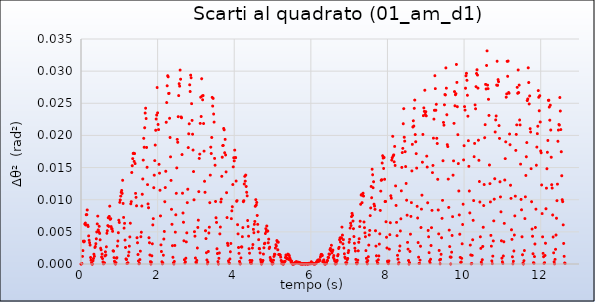
| Category | Series 0 |
|---|---|
| 0.0 | 0 |
| 0.0125 | 0 |
| 0.025 | 0 |
| 0.037500000000000006 | 0.001 |
| 0.05 | 0.002 |
| 0.0625 | 0.004 |
| 0.075 | 0.003 |
| 0.0875 | 0.004 |
| 0.09999999999999999 | 0.006 |
| 0.11249999999999999 | 0.006 |
| 0.12499999999999999 | 0.006 |
| 0.13749999999999998 | 0.008 |
| 0.15 | 0.008 |
| 0.1625 | 0.008 |
| 0.17500000000000002 | 0.006 |
| 0.18750000000000003 | 0.006 |
| 0.20000000000000004 | 0.004 |
| 0.21250000000000005 | 0.004 |
| 0.22500000000000006 | 0.003 |
| 0.23750000000000007 | 0.003 |
| 0.25000000000000006 | 0.001 |
| 0.26250000000000007 | 0.001 |
| 0.2750000000000001 | 0 |
| 0.2875000000000001 | 0 |
| 0.3000000000000001 | 0 |
| 0.3125000000000001 | 0 |
| 0.3250000000000001 | 0.001 |
| 0.33750000000000013 | 0.002 |
| 0.35000000000000014 | 0.001 |
| 0.36250000000000016 | 0.003 |
| 0.37500000000000017 | 0.003 |
| 0.3875000000000002 | 0.003 |
| 0.4000000000000002 | 0.004 |
| 0.4125000000000002 | 0.005 |
| 0.4250000000000002 | 0.006 |
| 0.4375000000000002 | 0.007 |
| 0.45000000000000023 | 0.005 |
| 0.46250000000000024 | 0.005 |
| 0.47500000000000026 | 0.006 |
| 0.48750000000000027 | 0.005 |
| 0.5000000000000002 | 0.004 |
| 0.5125000000000002 | 0.002 |
| 0.5250000000000001 | 0.002 |
| 0.5375000000000001 | 0.001 |
| 0.55 | 0.002 |
| 0.5625 | 0.001 |
| 0.575 | 0 |
| 0.5874999999999999 | 0 |
| 0.5999999999999999 | 0 |
| 0.6124999999999998 | 0 |
| 0.6249999999999998 | 0.001 |
| 0.6374999999999997 | 0.002 |
| 0.6499999999999997 | 0.001 |
| 0.6624999999999996 | 0.003 |
| 0.6749999999999996 | 0.005 |
| 0.6874999999999996 | 0.005 |
| 0.6999999999999995 | 0.006 |
| 0.7124999999999995 | 0.007 |
| 0.7249999999999994 | 0.006 |
| 0.7374999999999994 | 0.007 |
| 0.7499999999999993 | 0.009 |
| 0.7624999999999993 | 0.007 |
| 0.7749999999999992 | 0.007 |
| 0.7874999999999992 | 0.006 |
| 0.7999999999999992 | 0.006 |
| 0.8124999999999991 | 0.005 |
| 0.8249999999999991 | 0.005 |
| 0.837499999999999 | 0.002 |
| 0.849999999999999 | 0.002 |
| 0.8624999999999989 | 0.001 |
| 0.8749999999999989 | 0 |
| 0.8874999999999988 | 0 |
| 0.8999999999999988 | 0 |
| 0.9124999999999988 | 0 |
| 0.9249999999999987 | 0.001 |
| 0.9374999999999987 | 0.001 |
| 0.9499999999999986 | 0.003 |
| 0.9624999999999986 | 0.004 |
| 0.9749999999999985 | 0.005 |
| 0.9874999999999985 | 0.007 |
| 0.9999999999999984 | 0.006 |
| 1.0124999999999984 | 0.01 |
| 1.0249999999999984 | 0.01 |
| 1.0374999999999983 | 0.011 |
| 1.0499999999999983 | 0.011 |
| 1.0624999999999982 | 0.011 |
| 1.0749999999999982 | 0.011 |
| 1.0874999999999981 | 0.013 |
| 1.099999999999998 | 0.009 |
| 1.112499999999998 | 0.007 |
| 1.124999999999998 | 0.006 |
| 1.137499999999998 | 0.006 |
| 1.149999999999998 | 0.004 |
| 1.1624999999999979 | 0.003 |
| 1.1749999999999978 | 0.001 |
| 1.1874999999999978 | 0.001 |
| 1.1999999999999977 | 0 |
| 1.2124999999999977 | 0 |
| 1.2249999999999976 | 0 |
| 1.2374999999999976 | 0.001 |
| 1.2499999999999976 | 0.002 |
| 1.2624999999999975 | 0.003 |
| 1.2749999999999975 | 0.004 |
| 1.2874999999999974 | 0.006 |
| 1.2999999999999974 | 0.009 |
| 1.3124999999999973 | 0.01 |
| 1.3249999999999973 | 0.014 |
| 1.3374999999999972 | 0.015 |
| 1.3499999999999972 | 0.016 |
| 1.3624999999999972 | 0.017 |
| 1.3749999999999971 | 0.017 |
| 1.387499999999997 | 0.016 |
| 1.399999999999997 | 0.017 |
| 1.412499999999997 | 0.016 |
| 1.424999999999997 | 0.011 |
| 1.437499999999997 | 0.01 |
| 1.4499999999999968 | 0.009 |
| 1.4624999999999968 | 0.004 |
| 1.4749999999999968 | 0.003 |
| 1.4874999999999967 | 0.001 |
| 1.4999999999999967 | 0 |
| 1.5124999999999966 | 0 |
| 1.5249999999999966 | 0 |
| 1.5374999999999965 | 0.001 |
| 1.5499999999999965 | 0.002 |
| 1.5624999999999964 | 0.004 |
| 1.5749999999999964 | 0.005 |
| 1.5874999999999964 | 0.009 |
| 1.5999999999999963 | 0.011 |
| 1.6124999999999963 | 0.013 |
| 1.6249999999999962 | 0.016 |
| 1.6374999999999962 | 0.02 |
| 1.6499999999999961 | 0.018 |
| 1.662499999999996 | 0.021 |
| 1.674999999999996 | 0.023 |
| 1.687499999999996 | 0.024 |
| 1.699999999999996 | 0.023 |
| 1.712499999999996 | 0.018 |
| 1.7249999999999959 | 0.015 |
| 1.7374999999999958 | 0.012 |
| 1.7499999999999958 | 0.009 |
| 1.7624999999999957 | 0.009 |
| 1.7749999999999957 | 0.004 |
| 1.7874999999999956 | 0.003 |
| 1.7999999999999956 | 0.001 |
| 1.8124999999999956 | 0 |
| 1.8249999999999955 | 0 |
| 1.8374999999999955 | 0 |
| 1.8499999999999954 | 0.001 |
| 1.8624999999999954 | 0.003 |
| 1.8749999999999953 | 0.006 |
| 1.8874999999999953 | 0.007 |
| 1.8999999999999952 | 0.012 |
| 1.9124999999999952 | 0.014 |
| 1.9249999999999952 | 0.016 |
| 1.9374999999999951 | 0.019 |
| 1.949999999999995 | 0.021 |
| 1.962499999999995 | 0.023 |
| 1.974999999999995 | 0.023 |
| 1.987499999999995 | 0.027 |
| 1.999999999999995 | 0.024 |
| 2.012499999999995 | 0.022 |
| 2.024999999999995 | 0.021 |
| 2.037499999999995 | 0.016 |
| 2.0499999999999954 | 0.014 |
| 2.0624999999999956 | 0.011 |
| 2.0749999999999957 | 0.007 |
| 2.087499999999996 | 0.003 |
| 2.099999999999996 | 0.002 |
| 2.1124999999999963 | 0 |
| 2.1249999999999964 | 0 |
| 2.1374999999999966 | 0 |
| 2.149999999999997 | 0.001 |
| 2.162499999999997 | 0.004 |
| 2.174999999999997 | 0.005 |
| 2.1874999999999973 | 0.01 |
| 2.1999999999999975 | 0.012 |
| 2.2124999999999977 | 0.014 |
| 2.224999999999998 | 0.022 |
| 2.237499999999998 | 0.025 |
| 2.2499999999999982 | 0.028 |
| 2.2624999999999984 | 0.029 |
| 2.2749999999999986 | 0.029 |
| 2.2874999999999988 | 0.027 |
| 2.299999999999999 | 0.027 |
| 2.312499999999999 | 0.023 |
| 2.3249999999999993 | 0.02 |
| 2.3374999999999995 | 0.017 |
| 2.3499999999999996 | 0.013 |
| 2.3625 | 0.009 |
| 2.375 | 0.006 |
| 2.3875 | 0.003 |
| 2.4000000000000004 | 0.001 |
| 2.4125000000000005 | 0 |
| 2.4250000000000007 | 0 |
| 2.437500000000001 | 0 |
| 2.450000000000001 | 0.003 |
| 2.4625000000000012 | 0.005 |
| 2.4750000000000014 | 0.008 |
| 2.4875000000000016 | 0.011 |
| 2.5000000000000018 | 0.015 |
| 2.512500000000002 | 0.019 |
| 2.525000000000002 | 0.019 |
| 2.5375000000000023 | 0.023 |
| 2.5500000000000025 | 0.026 |
| 2.5625000000000027 | 0.028 |
| 2.575000000000003 | 0.028 |
| 2.587500000000003 | 0.03 |
| 2.600000000000003 | 0.029 |
| 2.6125000000000034 | 0.023 |
| 2.6250000000000036 | 0.023 |
| 2.6375000000000037 | 0.017 |
| 2.650000000000004 | 0.011 |
| 2.662500000000004 | 0.008 |
| 2.6750000000000043 | 0.006 |
| 2.6875000000000044 | 0.004 |
| 2.7000000000000046 | 0.001 |
| 2.712500000000005 | 0 |
| 2.725000000000005 | 0 |
| 2.737500000000005 | 0.001 |
| 2.7500000000000053 | 0.003 |
| 2.7625000000000055 | 0.005 |
| 2.7750000000000057 | 0.01 |
| 2.787500000000006 | 0.012 |
| 2.800000000000006 | 0.018 |
| 2.812500000000006 | 0.02 |
| 2.8250000000000064 | 0.022 |
| 2.8375000000000066 | 0.028 |
| 2.8500000000000068 | 0.027 |
| 2.862500000000007 | 0.029 |
| 2.875000000000007 | 0.029 |
| 2.8875000000000073 | 0.025 |
| 2.9000000000000075 | 0.022 |
| 2.9125000000000076 | 0.02 |
| 2.925000000000008 | 0.018 |
| 2.937500000000008 | 0.014 |
| 2.950000000000008 | 0.01 |
| 2.9625000000000083 | 0.005 |
| 2.9750000000000085 | 0.004 |
| 2.9875000000000087 | 0.001 |
| 3.000000000000009 | 0 |
| 3.012500000000009 | 0 |
| 3.0250000000000092 | 0.001 |
| 3.0375000000000094 | 0.002 |
| 3.0500000000000096 | 0.006 |
| 3.0625000000000098 | 0.007 |
| 3.07500000000001 | 0.011 |
| 3.08750000000001 | 0.016 |
| 3.1000000000000103 | 0.017 |
| 3.1125000000000105 | 0.022 |
| 3.1250000000000107 | 0.026 |
| 3.137500000000011 | 0.023 |
| 3.150000000000011 | 0.029 |
| 3.162500000000011 | 0.026 |
| 3.1750000000000114 | 0.026 |
| 3.1875000000000115 | 0.026 |
| 3.2000000000000117 | 0.022 |
| 3.212500000000012 | 0.018 |
| 3.225000000000012 | 0.013 |
| 3.2375000000000123 | 0.011 |
| 3.2500000000000124 | 0.005 |
| 3.2625000000000126 | 0.004 |
| 3.275000000000013 | 0.002 |
| 3.287500000000013 | 0.001 |
| 3.300000000000013 | 0 |
| 3.3125000000000133 | 0 |
| 3.3250000000000135 | 0.002 |
| 3.3375000000000137 | 0.005 |
| 3.350000000000014 | 0.006 |
| 3.362500000000014 | 0.01 |
| 3.375000000000014 | 0.014 |
| 3.3875000000000144 | 0.018 |
| 3.4000000000000146 | 0.017 |
| 3.4125000000000147 | 0.02 |
| 3.425000000000015 | 0.026 |
| 3.437500000000015 | 0.025 |
| 3.4500000000000153 | 0.026 |
| 3.4625000000000155 | 0.023 |
| 3.4750000000000156 | 0.022 |
| 3.487500000000016 | 0.016 |
| 3.500000000000016 | 0.015 |
| 3.512500000000016 | 0.01 |
| 3.5250000000000163 | 0.007 |
| 3.5375000000000165 | 0.006 |
| 3.5500000000000167 | 0.002 |
| 3.562500000000017 | 0.002 |
| 3.575000000000017 | 0 |
| 3.5875000000000172 | 0 |
| 3.6000000000000174 | 0.001 |
| 3.6125000000000176 | 0.002 |
| 3.6250000000000178 | 0.005 |
| 3.637500000000018 | 0.006 |
| 3.650000000000018 | 0.01 |
| 3.6625000000000183 | 0.01 |
| 3.6750000000000185 | 0.014 |
| 3.6875000000000187 | 0.017 |
| 3.700000000000019 | 0.018 |
| 3.712500000000019 | 0.018 |
| 3.725000000000019 | 0.021 |
| 3.7375000000000194 | 0.021 |
| 3.7500000000000195 | 0.017 |
| 3.7625000000000197 | 0.019 |
| 3.77500000000002 | 0.017 |
| 3.78750000000002 | 0.014 |
| 3.8000000000000203 | 0.011 |
| 3.8125000000000204 | 0.007 |
| 3.8250000000000206 | 0.003 |
| 3.837500000000021 | 0.003 |
| 3.850000000000021 | 0 |
| 3.862500000000021 | 0 |
| 3.8750000000000213 | 0 |
| 3.8875000000000215 | 0.001 |
| 3.9000000000000217 | 0.002 |
| 3.912500000000022 | 0.003 |
| 3.925000000000022 | 0.007 |
| 3.937500000000022 | 0.008 |
| 3.9500000000000224 | 0.009 |
| 3.9625000000000226 | 0.012 |
| 3.9750000000000227 | 0.015 |
| 3.987500000000023 | 0.017 |
| 4.000000000000023 | 0.016 |
| 4.012500000000023 | 0.018 |
| 4.0250000000000234 | 0.017 |
| 4.037500000000024 | 0.017 |
| 4.050000000000024 | 0.013 |
| 4.062500000000024 | 0.01 |
| 4.075000000000024 | 0.01 |
| 4.087500000000024 | 0.006 |
| 4.1000000000000245 | 0.005 |
| 4.112500000000025 | 0.003 |
| 4.125000000000025 | 0.002 |
| 4.137500000000025 | 0 |
| 4.150000000000025 | 0 |
| 4.162500000000025 | 0 |
| 4.175000000000026 | 0.001 |
| 4.187500000000026 | 0.003 |
| 4.200000000000026 | 0.003 |
| 4.212500000000026 | 0.004 |
| 4.225000000000026 | 0.006 |
| 4.2375000000000265 | 0.01 |
| 4.250000000000027 | 0.01 |
| 4.262500000000027 | 0.012 |
| 4.275000000000027 | 0.014 |
| 4.287500000000027 | 0.013 |
| 4.300000000000027 | 0.014 |
| 4.3125000000000275 | 0.012 |
| 4.325000000000028 | 0.011 |
| 4.337500000000028 | 0.011 |
| 4.350000000000028 | 0.007 |
| 4.362500000000028 | 0.006 |
| 4.375000000000028 | 0.004 |
| 4.387500000000029 | 0.002 |
| 4.400000000000029 | 0.002 |
| 4.412500000000029 | 0.001 |
| 4.425000000000029 | 0 |
| 4.437500000000029 | 0 |
| 4.4500000000000295 | 0 |
| 4.46250000000003 | 0.001 |
| 4.47500000000003 | 0.002 |
| 4.48750000000003 | 0.003 |
| 4.50000000000003 | 0.005 |
| 4.51250000000003 | 0.005 |
| 4.5250000000000306 | 0.006 |
| 4.537500000000031 | 0.007 |
| 4.550000000000031 | 0.009 |
| 4.562500000000031 | 0.01 |
| 4.575000000000031 | 0.009 |
| 4.587500000000031 | 0.01 |
| 4.600000000000032 | 0.008 |
| 4.612500000000032 | 0.006 |
| 4.625000000000032 | 0.005 |
| 4.637500000000032 | 0.004 |
| 4.650000000000032 | 0.002 |
| 4.6625000000000325 | 0.002 |
| 4.675000000000033 | 0.002 |
| 4.687500000000033 | 0.001 |
| 4.700000000000033 | 0 |
| 4.712500000000033 | 0 |
| 4.725000000000033 | 0 |
| 4.737500000000034 | 0 |
| 4.750000000000034 | 0.001 |
| 4.762500000000034 | 0.002 |
| 4.775000000000034 | 0.003 |
| 4.787500000000034 | 0.003 |
| 4.8000000000000345 | 0.003 |
| 4.812500000000035 | 0.005 |
| 4.825000000000035 | 0.005 |
| 4.837500000000035 | 0.005 |
| 4.850000000000035 | 0.006 |
| 4.862500000000035 | 0.005 |
| 4.8750000000000355 | 0.005 |
| 4.887500000000036 | 0.003 |
| 4.900000000000036 | 0.004 |
| 4.912500000000036 | 0.002 |
| 4.925000000000036 | 0.003 |
| 4.937500000000036 | 0.001 |
| 4.950000000000037 | 0.001 |
| 4.962500000000037 | 0.001 |
| 4.975000000000037 | 0 |
| 4.987500000000037 | 0 |
| 5.000000000000037 | 0 |
| 5.0125000000000375 | 0 |
| 5.025000000000038 | 0.001 |
| 5.037500000000038 | 0.001 |
| 5.050000000000038 | 0.002 |
| 5.062500000000038 | 0.001 |
| 5.075000000000038 | 0.002 |
| 5.0875000000000385 | 0.003 |
| 5.100000000000039 | 0.003 |
| 5.112500000000039 | 0.004 |
| 5.125000000000039 | 0.003 |
| 5.137500000000039 | 0.002 |
| 5.150000000000039 | 0.003 |
| 5.16250000000004 | 0.001 |
| 5.17500000000004 | 0.001 |
| 5.18750000000004 | 0.001 |
| 5.20000000000004 | 0.001 |
| 5.21250000000004 | 0.001 |
| 5.2250000000000405 | 0.001 |
| 5.237500000000041 | 0 |
| 5.250000000000041 | 0 |
| 5.262500000000041 | 0 |
| 5.275000000000041 | 0 |
| 5.287500000000041 | 0 |
| 5.300000000000042 | 0 |
| 5.312500000000042 | 0 |
| 5.325000000000042 | 0 |
| 5.337500000000042 | 0.001 |
| 5.350000000000042 | 0.001 |
| 5.3625000000000425 | 0.001 |
| 5.375000000000043 | 0.001 |
| 5.387500000000043 | 0.001 |
| 5.400000000000043 | 0.002 |
| 5.412500000000043 | 0.001 |
| 5.425000000000043 | 0.001 |
| 5.4375000000000435 | 0.001 |
| 5.450000000000044 | 0.001 |
| 5.462500000000044 | 0.001 |
| 5.475000000000044 | 0 |
| 5.487500000000044 | 0 |
| 5.500000000000044 | 0 |
| 5.512500000000045 | 0 |
| 5.525000000000045 | 0 |
| 5.537500000000045 | 0 |
| 5.550000000000045 | 0 |
| 5.562500000000045 | 0 |
| 5.5750000000000455 | 0 |
| 5.587500000000046 | 0 |
| 5.600000000000046 | 0 |
| 5.612500000000046 | 0 |
| 5.625000000000046 | 0 |
| 5.637500000000046 | 0 |
| 5.6500000000000465 | 0 |
| 5.662500000000047 | 0 |
| 5.675000000000047 | 0 |
| 5.687500000000047 | 0 |
| 5.700000000000047 | 0 |
| 5.712500000000047 | 0 |
| 5.725000000000048 | 0 |
| 5.737500000000048 | 0 |
| 5.750000000000048 | 0 |
| 5.762500000000048 | 0 |
| 5.775000000000048 | 0 |
| 5.7875000000000485 | 0 |
| 5.800000000000049 | 0 |
| 5.812500000000049 | 0 |
| 5.825000000000049 | 0 |
| 5.837500000000049 | 0 |
| 5.850000000000049 | 0 |
| 5.86250000000005 | 0 |
| 5.87500000000005 | 0 |
| 5.88750000000005 | 0 |
| 5.90000000000005 | 0 |
| 5.91250000000005 | 0 |
| 5.9250000000000504 | 0 |
| 5.937500000000051 | 0 |
| 5.950000000000051 | 0 |
| 5.962500000000051 | 0 |
| 5.975000000000051 | 0 |
| 5.987500000000051 | 0 |
| 6.0000000000000515 | 0 |
| 6.012500000000052 | 0 |
| 6.025000000000052 | 0 |
| 6.037500000000052 | 0 |
| 6.050000000000052 | 0 |
| 6.062500000000052 | 0 |
| 6.075000000000053 | 0 |
| 6.087500000000053 | 0 |
| 6.100000000000053 | 0 |
| 6.112500000000053 | 0 |
| 6.125000000000053 | 0 |
| 6.1375000000000535 | 0 |
| 6.150000000000054 | 0 |
| 6.162500000000054 | 0 |
| 6.175000000000054 | 0.001 |
| 6.187500000000054 | 0 |
| 6.200000000000054 | 0.001 |
| 6.2125000000000545 | 0 |
| 6.225000000000055 | 0.001 |
| 6.237500000000055 | 0.001 |
| 6.250000000000055 | 0.001 |
| 6.262500000000055 | 0.001 |
| 6.275000000000055 | 0.001 |
| 6.287500000000056 | 0.001 |
| 6.300000000000056 | 0.001 |
| 6.312500000000056 | 0 |
| 6.325000000000056 | 0 |
| 6.337500000000056 | 0.001 |
| 6.3500000000000565 | 0 |
| 6.362500000000057 | 0 |
| 6.375000000000057 | 0 |
| 6.387500000000057 | 0 |
| 6.400000000000057 | 0 |
| 6.412500000000057 | 0 |
| 6.4250000000000576 | 0.001 |
| 6.437500000000058 | 0.001 |
| 6.450000000000058 | 0.001 |
| 6.462500000000058 | 0.001 |
| 6.475000000000058 | 0.002 |
| 6.487500000000058 | 0.001 |
| 6.500000000000059 | 0.002 |
| 6.512500000000059 | 0.002 |
| 6.525000000000059 | 0.002 |
| 6.537500000000059 | 0.003 |
| 6.550000000000059 | 0.002 |
| 6.5625000000000595 | 0.002 |
| 6.57500000000006 | 0.002 |
| 6.58750000000006 | 0.001 |
| 6.60000000000006 | 0.001 |
| 6.61250000000006 | 0.001 |
| 6.62500000000006 | 0 |
| 6.637500000000061 | 0 |
| 6.650000000000061 | 0 |
| 6.662500000000061 | 0 |
| 6.675000000000061 | 0 |
| 6.687500000000061 | 0.001 |
| 6.7000000000000615 | 0.001 |
| 6.712500000000062 | 0.001 |
| 6.725000000000062 | 0.002 |
| 6.737500000000062 | 0.003 |
| 6.750000000000062 | 0.004 |
| 6.762500000000062 | 0.004 |
| 6.7750000000000625 | 0.003 |
| 6.787500000000063 | 0.004 |
| 6.800000000000063 | 0.004 |
| 6.812500000000063 | 0.006 |
| 6.825000000000063 | 0.004 |
| 6.837500000000063 | 0.003 |
| 6.850000000000064 | 0.004 |
| 6.862500000000064 | 0.002 |
| 6.875000000000064 | 0.002 |
| 6.887500000000064 | 0.001 |
| 6.900000000000064 | 0.001 |
| 6.9125000000000645 | 0 |
| 6.925000000000065 | 0 |
| 6.937500000000065 | 0 |
| 6.950000000000065 | 0.001 |
| 6.962500000000065 | 0.001 |
| 6.975000000000065 | 0.002 |
| 6.9875000000000655 | 0.002 |
| 7.000000000000066 | 0.003 |
| 7.012500000000066 | 0.004 |
| 7.025000000000066 | 0.006 |
| 7.037500000000066 | 0.006 |
| 7.050000000000066 | 0.006 |
| 7.062500000000067 | 0.007 |
| 7.075000000000067 | 0.008 |
| 7.087500000000067 | 0.008 |
| 7.100000000000067 | 0.007 |
| 7.112500000000067 | 0.005 |
| 7.1250000000000675 | 0.004 |
| 7.137500000000068 | 0.003 |
| 7.150000000000068 | 0.002 |
| 7.162500000000068 | 0.002 |
| 7.175000000000068 | 0.001 |
| 7.187500000000068 | 0 |
| 7.200000000000069 | 0 |
| 7.212500000000069 | 0 |
| 7.225000000000069 | 0.001 |
| 7.237500000000069 | 0.002 |
| 7.250000000000069 | 0.003 |
| 7.2625000000000695 | 0.004 |
| 7.27500000000007 | 0.006 |
| 7.28750000000007 | 0.007 |
| 7.30000000000007 | 0.009 |
| 7.31250000000007 | 0.011 |
| 7.32500000000007 | 0.011 |
| 7.3375000000000705 | 0.01 |
| 7.350000000000071 | 0.011 |
| 7.362500000000071 | 0.011 |
| 7.375000000000071 | 0.011 |
| 7.387500000000071 | 0.007 |
| 7.400000000000071 | 0.006 |
| 7.412500000000072 | 0.005 |
| 7.425000000000072 | 0.004 |
| 7.437500000000072 | 0.002 |
| 7.450000000000072 | 0.001 |
| 7.462500000000072 | 0 |
| 7.4750000000000725 | 0 |
| 7.487500000000073 | 0.001 |
| 7.500000000000073 | 0.001 |
| 7.512500000000073 | 0.003 |
| 7.525000000000073 | 0.005 |
| 7.537500000000073 | 0.005 |
| 7.5500000000000735 | 0.008 |
| 7.562500000000074 | 0.009 |
| 7.575000000000074 | 0.012 |
| 7.587500000000074 | 0.01 |
| 7.600000000000074 | 0.015 |
| 7.612500000000074 | 0.014 |
| 7.625000000000075 | 0.012 |
| 7.637500000000075 | 0.013 |
| 7.650000000000075 | 0.009 |
| 7.662500000000075 | 0.009 |
| 7.675000000000075 | 0.009 |
| 7.6875000000000755 | 0.005 |
| 7.700000000000076 | 0.003 |
| 7.712500000000076 | 0.001 |
| 7.725000000000076 | 0 |
| 7.737500000000076 | 0 |
| 7.750000000000076 | 0 |
| 7.762500000000077 | 0.001 |
| 7.775000000000077 | 0.001 |
| 7.787500000000077 | 0.003 |
| 7.800000000000077 | 0.005 |
| 7.812500000000077 | 0.008 |
| 7.8250000000000774 | 0.011 |
| 7.837500000000078 | 0.013 |
| 7.850000000000078 | 0.013 |
| 7.862500000000078 | 0.016 |
| 7.875000000000078 | 0.017 |
| 7.887500000000078 | 0.016 |
| 7.9000000000000785 | 0.015 |
| 7.912500000000079 | 0.017 |
| 7.925000000000079 | 0.013 |
| 7.937500000000079 | 0.01 |
| 7.950000000000079 | 0.01 |
| 7.962500000000079 | 0.007 |
| 7.97500000000008 | 0.004 |
| 7.98750000000008 | 0.002 |
| 8.00000000000008 | 0 |
| 8.01250000000008 | 0 |
| 8.025000000000079 | 0 |
| 8.037500000000078 | 0 |
| 8.050000000000077 | 0.002 |
| 8.062500000000076 | 0.005 |
| 8.075000000000076 | 0.006 |
| 8.087500000000075 | 0.011 |
| 8.100000000000074 | 0.01 |
| 8.112500000000074 | 0.016 |
| 8.125000000000073 | 0.017 |
| 8.137500000000072 | 0.02 |
| 8.150000000000071 | 0.017 |
| 8.16250000000007 | 0.017 |
| 8.17500000000007 | 0.016 |
| 8.18750000000007 | 0.018 |
| 8.200000000000069 | 0.015 |
| 8.212500000000068 | 0.012 |
| 8.225000000000067 | 0.009 |
| 8.237500000000066 | 0.006 |
| 8.250000000000066 | 0.004 |
| 8.262500000000065 | 0.001 |
| 8.275000000000064 | 0.001 |
| 8.287500000000064 | 0 |
| 8.300000000000063 | 0 |
| 8.312500000000062 | 0.002 |
| 8.325000000000061 | 0.003 |
| 8.33750000000006 | 0.005 |
| 8.35000000000006 | 0.007 |
| 8.36250000000006 | 0.011 |
| 8.375000000000059 | 0.015 |
| 8.387500000000058 | 0.017 |
| 8.400000000000057 | 0.018 |
| 8.412500000000056 | 0.022 |
| 8.425000000000056 | 0.024 |
| 8.437500000000055 | 0.02 |
| 8.450000000000054 | 0.019 |
| 8.462500000000054 | 0.017 |
| 8.475000000000053 | 0.015 |
| 8.487500000000052 | 0.013 |
| 8.500000000000052 | 0.01 |
| 8.51250000000005 | 0.008 |
| 8.52500000000005 | 0.003 |
| 8.53750000000005 | 0.002 |
| 8.550000000000049 | 0.001 |
| 8.562500000000048 | 0 |
| 8.575000000000047 | 0 |
| 8.587500000000047 | 0.002 |
| 8.600000000000046 | 0.005 |
| 8.612500000000045 | 0.007 |
| 8.625000000000044 | 0.01 |
| 8.637500000000044 | 0.014 |
| 8.650000000000043 | 0.019 |
| 8.662500000000042 | 0.021 |
| 8.675000000000042 | 0.022 |
| 8.68750000000004 | 0.021 |
| 8.70000000000004 | 0.024 |
| 8.71250000000004 | 0.025 |
| 8.725000000000039 | 0.02 |
| 8.737500000000038 | 0.019 |
| 8.750000000000037 | 0.017 |
| 8.762500000000037 | 0.015 |
| 8.775000000000036 | 0.009 |
| 8.787500000000035 | 0.007 |
| 8.800000000000034 | 0.003 |
| 8.812500000000034 | 0.001 |
| 8.825000000000033 | 0 |
| 8.837500000000032 | 0 |
| 8.850000000000032 | 0.001 |
| 8.862500000000031 | 0.003 |
| 8.87500000000003 | 0.006 |
| 8.88750000000003 | 0.009 |
| 8.900000000000029 | 0.011 |
| 8.912500000000028 | 0.016 |
| 8.925000000000027 | 0.02 |
| 8.937500000000027 | 0.023 |
| 8.950000000000026 | 0.024 |
| 8.962500000000025 | 0.024 |
| 8.975000000000025 | 0.027 |
| 8.987500000000024 | 0.023 |
| 9.000000000000023 | 0.024 |
| 9.012500000000022 | 0.023 |
| 9.025000000000022 | 0.017 |
| 9.037500000000021 | 0.015 |
| 9.05000000000002 | 0.01 |
| 9.06250000000002 | 0.005 |
| 9.075000000000019 | 0.004 |
| 9.087500000000018 | 0.002 |
| 9.100000000000017 | 0 |
| 9.112500000000017 | 0 |
| 9.125000000000016 | 0.001 |
| 9.137500000000015 | 0.003 |
| 9.150000000000015 | 0.006 |
| 9.162500000000014 | 0.008 |
| 9.175000000000013 | 0.014 |
| 9.187500000000012 | 0.015 |
| 9.200000000000012 | 0.02 |
| 9.212500000000011 | 0.023 |
| 9.22500000000001 | 0.024 |
| 9.23750000000001 | 0.029 |
| 9.250000000000009 | 0.027 |
| 9.262500000000008 | 0.024 |
| 9.275000000000007 | 0.025 |
| 9.287500000000007 | 0.02 |
| 9.300000000000006 | 0.019 |
| 9.312500000000005 | 0.013 |
| 9.325000000000005 | 0.008 |
| 9.337500000000004 | 0.005 |
| 9.350000000000003 | 0.002 |
| 9.362500000000002 | 0.001 |
| 9.375000000000002 | 0 |
| 9.387500000000001 | 0.001 |
| 9.4 | 0.002 |
| 9.4125 | 0.004 |
| 9.424999999999999 | 0.007 |
| 9.437499999999998 | 0.01 |
| 9.449999999999998 | 0.016 |
| 9.462499999999997 | 0.022 |
| 9.474999999999996 | 0.022 |
| 9.487499999999995 | 0.025 |
| 9.499999999999995 | 0.026 |
| 9.512499999999994 | 0.026 |
| 9.524999999999993 | 0.031 |
| 9.537499999999993 | 0.027 |
| 9.549999999999992 | 0.023 |
| 9.562499999999991 | 0.019 |
| 9.57499999999999 | 0.018 |
| 9.58749999999999 | 0.013 |
| 9.599999999999989 | 0.009 |
| 9.612499999999988 | 0.005 |
| 9.624999999999988 | 0.003 |
| 9.637499999999987 | 0.001 |
| 9.649999999999986 | 0 |
| 9.662499999999985 | 0.001 |
| 9.674999999999985 | 0.002 |
| 9.687499999999984 | 0.004 |
| 9.699999999999983 | 0.007 |
| 9.712499999999983 | 0.014 |
| 9.724999999999982 | 0.016 |
| 9.737499999999981 | 0.022 |
| 9.74999999999998 | 0.027 |
| 9.76249999999998 | 0.025 |
| 9.774999999999979 | 0.026 |
| 9.787499999999978 | 0.026 |
| 9.799999999999978 | 0.031 |
| 9.812499999999977 | 0.028 |
| 9.824999999999976 | 0.024 |
| 9.837499999999975 | 0.02 |
| 9.849999999999975 | 0.016 |
| 9.862499999999974 | 0.011 |
| 9.874999999999973 | 0.008 |
| 9.887499999999973 | 0.005 |
| 9.899999999999972 | 0.001 |
| 9.912499999999971 | 0 |
| 9.92499999999997 | 0 |
| 9.93749999999997 | 0.001 |
| 9.949999999999969 | 0.003 |
| 9.962499999999968 | 0.006 |
| 9.974999999999968 | 0.009 |
| 9.987499999999967 | 0.016 |
| 9.999999999999966 | 0.018 |
| 10.012499999999966 | 0.024 |
| 10.024999999999965 | 0.024 |
| 10.037499999999964 | 0.027 |
| 10.049999999999963 | 0.029 |
| 10.062499999999963 | 0.03 |
| 10.074999999999962 | 0.029 |
| 10.087499999999961 | 0.026 |
| 10.09999999999996 | 0.023 |
| 10.11249999999996 | 0.019 |
| 10.12499999999996 | 0.015 |
| 10.137499999999958 | 0.011 |
| 10.149999999999958 | 0.008 |
| 10.162499999999957 | 0.003 |
| 10.174999999999956 | 0.001 |
| 10.187499999999956 | 0 |
| 10.199999999999955 | 0 |
| 10.212499999999954 | 0.001 |
| 10.224999999999953 | 0.004 |
| 10.237499999999953 | 0.007 |
| 10.249999999999952 | 0.01 |
| 10.262499999999951 | 0.017 |
| 10.27499999999995 | 0.019 |
| 10.28749999999995 | 0.025 |
| 10.29999999999995 | 0.024 |
| 10.312499999999948 | 0.028 |
| 10.324999999999948 | 0.03 |
| 10.337499999999947 | 0.03 |
| 10.349999999999946 | 0.029 |
| 10.362499999999946 | 0.027 |
| 10.374999999999945 | 0.019 |
| 10.387499999999944 | 0.016 |
| 10.399999999999944 | 0.013 |
| 10.412499999999943 | 0.01 |
| 10.424999999999942 | 0.004 |
| 10.437499999999941 | 0.002 |
| 10.44999999999994 | 0 |
| 10.46249999999994 | 0 |
| 10.47499999999994 | 0.001 |
| 10.487499999999939 | 0.003 |
| 10.499999999999938 | 0.006 |
| 10.512499999999937 | 0.009 |
| 10.524999999999936 | 0.012 |
| 10.537499999999936 | 0.02 |
| 10.549999999999935 | 0.022 |
| 10.562499999999934 | 0.028 |
| 10.574999999999934 | 0.027 |
| 10.587499999999933 | 0.031 |
| 10.599999999999932 | 0.033 |
| 10.612499999999931 | 0.028 |
| 10.62499999999993 | 0.027 |
| 10.63749999999993 | 0.026 |
| 10.64999999999993 | 0.023 |
| 10.662499999999929 | 0.015 |
| 10.674999999999928 | 0.012 |
| 10.687499999999927 | 0.01 |
| 10.699999999999926 | 0.004 |
| 10.712499999999926 | 0.003 |
| 10.724999999999925 | 0 |
| 10.737499999999924 | 0 |
| 10.749999999999924 | 0.001 |
| 10.762499999999923 | 0.004 |
| 10.774999999999922 | 0.007 |
| 10.787499999999921 | 0.01 |
| 10.79999999999992 | 0.013 |
| 10.81249999999992 | 0.021 |
| 10.82499999999992 | 0.022 |
| 10.837499999999919 | 0.023 |
| 10.849999999999918 | 0.028 |
| 10.862499999999917 | 0.032 |
| 10.874999999999917 | 0.028 |
| 10.887499999999916 | 0.029 |
| 10.899999999999915 | 0.028 |
| 10.912499999999914 | 0.022 |
| 10.924999999999914 | 0.02 |
| 10.937499999999913 | 0.013 |
| 10.949999999999912 | 0.01 |
| 10.962499999999912 | 0.008 |
| 10.97499999999991 | 0.004 |
| 10.98749999999991 | 0.001 |
| 10.99999999999991 | 0 |
| 11.012499999999909 | 0 |
| 11.024999999999908 | 0.001 |
| 11.037499999999907 | 0.003 |
| 11.049999999999907 | 0.006 |
| 11.062499999999906 | 0.013 |
| 11.074999999999905 | 0.016 |
| 11.087499999999904 | 0.019 |
| 11.099999999999904 | 0.026 |
| 11.112499999999903 | 0.026 |
| 11.124999999999902 | 0.032 |
| 11.137499999999902 | 0.029 |
| 11.1499999999999 | 0.032 |
| 11.1624999999999 | 0.027 |
| 11.1749999999999 | 0.027 |
| 11.187499999999899 | 0.02 |
| 11.199999999999898 | 0.019 |
| 11.212499999999897 | 0.012 |
| 11.224999999999897 | 0.01 |
| 11.237499999999896 | 0.005 |
| 11.249999999999895 | 0.004 |
| 11.262499999999894 | 0.001 |
| 11.274999999999894 | 0 |
| 11.287499999999893 | 0 |
| 11.299999999999892 | 0.002 |
| 11.312499999999892 | 0.005 |
| 11.324999999999891 | 0.007 |
| 11.33749999999989 | 0.011 |
| 11.34999999999989 | 0.018 |
| 11.362499999999889 | 0.02 |
| 11.374999999999888 | 0.022 |
| 11.387499999999887 | 0.027 |
| 11.399999999999887 | 0.027 |
| 11.412499999999886 | 0.03 |
| 11.424999999999885 | 0.027 |
| 11.437499999999885 | 0.028 |
| 11.449999999999884 | 0.022 |
| 11.462499999999883 | 0.022 |
| 11.474999999999882 | 0.016 |
| 11.487499999999882 | 0.01 |
| 11.499999999999881 | 0.008 |
| 11.51249999999988 | 0.004 |
| 11.52499999999988 | 0.001 |
| 11.537499999999879 | 0 |
| 11.549999999999878 | 0 |
| 11.562499999999877 | 0.001 |
| 11.574999999999877 | 0.002 |
| 11.587499999999876 | 0.007 |
| 11.599999999999875 | 0.01 |
| 11.612499999999875 | 0.014 |
| 11.624999999999874 | 0.017 |
| 11.637499999999873 | 0.019 |
| 11.649999999999872 | 0.025 |
| 11.662499999999872 | 0.026 |
| 11.674999999999871 | 0.031 |
| 11.68749999999987 | 0.028 |
| 11.69999999999987 | 0.025 |
| 11.712499999999869 | 0.026 |
| 11.724999999999868 | 0.021 |
| 11.737499999999867 | 0.021 |
| 11.749999999999867 | 0.015 |
| 11.762499999999866 | 0.01 |
| 11.774999999999865 | 0.005 |
| 11.787499999999865 | 0.004 |
| 11.799999999999864 | 0.002 |
| 11.812499999999863 | 0 |
| 11.824999999999863 | 0 |
| 11.837499999999862 | 0.001 |
| 11.849999999999861 | 0.003 |
| 11.86249999999986 | 0.006 |
| 11.87499999999986 | 0.009 |
| 11.887499999999859 | 0.015 |
| 11.899999999999858 | 0.018 |
| 11.912499999999858 | 0.02 |
| 11.924999999999857 | 0.021 |
| 11.937499999999856 | 0.027 |
| 11.949999999999855 | 0.026 |
| 11.962499999999855 | 0.024 |
| 11.974999999999854 | 0.026 |
| 11.987499999999853 | 0.022 |
| 11.999999999999853 | 0.018 |
| 12.012499999999852 | 0.017 |
| 12.024999999999851 | 0.012 |
| 12.03749999999985 | 0.008 |
| 12.04999999999985 | 0.004 |
| 12.062499999999849 | 0.002 |
| 12.074999999999848 | 0.001 |
| 12.087499999999848 | 0 |
| 12.099999999999847 | 0 |
| 12.112499999999846 | 0.001 |
| 12.124999999999845 | 0.003 |
| 12.137499999999845 | 0.009 |
| 12.149999999999844 | 0.012 |
| 12.162499999999843 | 0.015 |
| 12.174999999999843 | 0.017 |
| 12.187499999999842 | 0.019 |
| 12.199999999999841 | 0.025 |
| 12.21249999999984 | 0.025 |
| 12.22499999999984 | 0.024 |
| 12.237499999999839 | 0.022 |
| 12.249999999999838 | 0.025 |
| 12.262499999999838 | 0.021 |
| 12.274999999999837 | 0.017 |
| 12.287499999999836 | 0.012 |
| 12.299999999999836 | 0.012 |
| 12.312499999999835 | 0.008 |
| 12.324999999999834 | 0.004 |
| 12.337499999999833 | 0.002 |
| 12.349999999999833 | 0 |
| 12.362499999999832 | 0 |
| 12.374999999999831 | 0.001 |
| 12.38749999999983 | 0.002 |
| 12.39999999999983 | 0.005 |
| 12.41249999999983 | 0.007 |
| 12.424999999999828 | 0.01 |
| 12.437499999999828 | 0.012 |
| 12.449999999999827 | 0.019 |
| 12.462499999999826 | 0.021 |
| 12.474999999999826 | 0.022 |
| 12.487499999999825 | 0.022 |
| 12.499999999999824 | 0.026 |
| 12.512499999999823 | 0.024 |
| 12.524999999999823 | 0.021 |
| 12.537499999999822 | 0.017 |
| 12.549999999999821 | 0.014 |
| 12.56249999999982 | 0.01 |
| 12.57499999999982 | 0.01 |
| 12.58749999999982 | 0.006 |
| 12.599999999999818 | 0.003 |
| 12.612499999999818 | 0.001 |
| 12.624999999999817 | 0 |
| 12.637499999999816 | 0 |